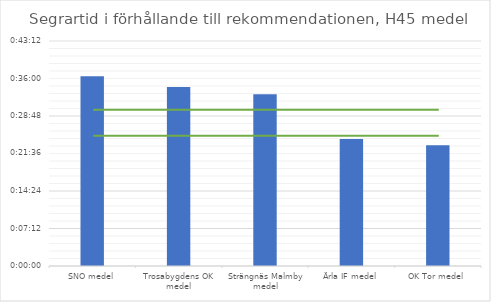
| Category | H45 tid |
|---|---|
| SNO medel | 0.025 |
| Trosabygdens OK medel | 0.024 |
| Strängnäs Malmby medel | 0.023 |
| Ärla IF medel | 0.017 |
| OK Tor medel | 0.016 |